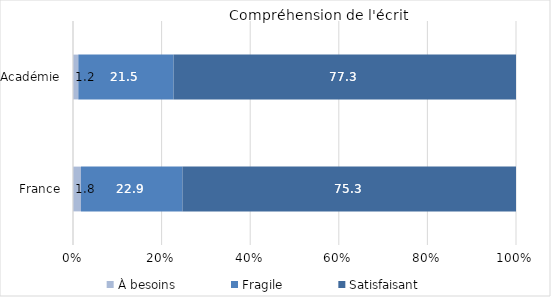
| Category | À besoins | Fragile | Satisfaisant |
|---|---|---|---|
| France | 1.8 | 22.9 | 75.3 |
| Académie | 1.2 | 21.5 | 77.3 |